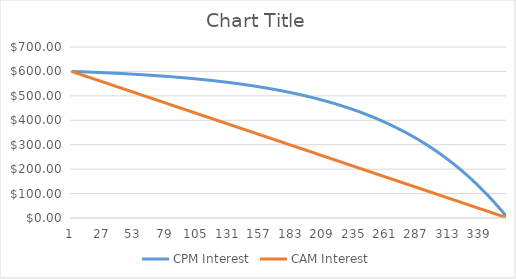
| Category | CPM Interest | CAM Interest |
|---|---|---|
| 0 | 600 | 600 |
| 1 | 599.828 | 598.333 |
| 2 | 599.655 | 596.667 |
| 3 | 599.48 | 595 |
| 4 | 599.303 | 593.333 |
| 5 | 599.124 | 591.667 |
| 6 | 598.944 | 590 |
| 7 | 598.762 | 588.333 |
| 8 | 598.578 | 586.667 |
| 9 | 598.392 | 585 |
| 10 | 598.204 | 583.333 |
| 11 | 598.014 | 581.667 |
| 12 | 597.823 | 580 |
| 13 | 597.629 | 578.333 |
| 14 | 597.434 | 576.667 |
| 15 | 597.237 | 575 |
| 16 | 597.037 | 573.333 |
| 17 | 596.836 | 571.667 |
| 18 | 596.633 | 570 |
| 19 | 596.427 | 568.333 |
| 20 | 596.22 | 566.667 |
| 21 | 596.01 | 565 |
| 22 | 595.799 | 563.333 |
| 23 | 595.585 | 561.667 |
| 24 | 595.369 | 560 |
| 25 | 595.151 | 558.333 |
| 26 | 594.931 | 556.667 |
| 27 | 594.709 | 555 |
| 28 | 594.484 | 553.333 |
| 29 | 594.257 | 551.667 |
| 30 | 594.028 | 550 |
| 31 | 593.797 | 548.333 |
| 32 | 593.563 | 546.667 |
| 33 | 593.327 | 545 |
| 34 | 593.089 | 543.333 |
| 35 | 592.848 | 541.667 |
| 36 | 592.605 | 540 |
| 37 | 592.359 | 538.333 |
| 38 | 592.111 | 536.667 |
| 39 | 591.86 | 535 |
| 40 | 591.607 | 533.333 |
| 41 | 591.352 | 531.667 |
| 42 | 591.094 | 530 |
| 43 | 590.833 | 528.333 |
| 44 | 590.57 | 526.667 |
| 45 | 590.304 | 525 |
| 46 | 590.035 | 523.333 |
| 47 | 589.764 | 521.667 |
| 48 | 589.49 | 520 |
| 49 | 589.213 | 518.333 |
| 50 | 588.933 | 516.667 |
| 51 | 588.651 | 515 |
| 52 | 588.366 | 513.333 |
| 53 | 588.078 | 511.667 |
| 54 | 587.787 | 510 |
| 55 | 587.493 | 508.333 |
| 56 | 587.196 | 506.667 |
| 57 | 586.897 | 505 |
| 58 | 586.594 | 503.333 |
| 59 | 586.288 | 501.667 |
| 60 | 585.979 | 500 |
| 61 | 585.667 | 498.333 |
| 62 | 585.352 | 496.667 |
| 63 | 585.034 | 495 |
| 64 | 584.713 | 493.333 |
| 65 | 584.388 | 491.667 |
| 66 | 584.061 | 490 |
| 67 | 583.73 | 488.333 |
| 68 | 583.395 | 486.667 |
| 69 | 583.057 | 485 |
| 70 | 582.716 | 483.333 |
| 71 | 582.372 | 481.667 |
| 72 | 582.024 | 480 |
| 73 | 581.672 | 478.333 |
| 74 | 581.317 | 476.667 |
| 75 | 580.959 | 475 |
| 76 | 580.597 | 473.333 |
| 77 | 580.231 | 471.667 |
| 78 | 579.862 | 470 |
| 79 | 579.489 | 468.333 |
| 80 | 579.112 | 466.667 |
| 81 | 578.731 | 465 |
| 82 | 578.347 | 463.333 |
| 83 | 577.959 | 461.667 |
| 84 | 577.567 | 460 |
| 85 | 577.171 | 458.333 |
| 86 | 576.771 | 456.667 |
| 87 | 576.367 | 455 |
| 88 | 575.959 | 453.333 |
| 89 | 575.547 | 451.667 |
| 90 | 575.131 | 450 |
| 91 | 574.71 | 448.333 |
| 92 | 574.286 | 446.667 |
| 93 | 573.857 | 445 |
| 94 | 573.424 | 443.333 |
| 95 | 572.986 | 441.667 |
| 96 | 572.544 | 440 |
| 97 | 572.098 | 438.333 |
| 98 | 571.647 | 436.667 |
| 99 | 571.192 | 435 |
| 100 | 570.733 | 433.333 |
| 101 | 570.268 | 431.667 |
| 102 | 569.799 | 430 |
| 103 | 569.325 | 428.333 |
| 104 | 568.847 | 426.667 |
| 105 | 568.364 | 425 |
| 106 | 567.876 | 423.333 |
| 107 | 567.383 | 421.667 |
| 108 | 566.885 | 420 |
| 109 | 566.382 | 418.333 |
| 110 | 565.874 | 416.667 |
| 111 | 565.361 | 415 |
| 112 | 564.843 | 413.333 |
| 113 | 564.32 | 411.667 |
| 114 | 563.792 | 410 |
| 115 | 563.258 | 408.333 |
| 116 | 562.719 | 406.667 |
| 117 | 562.174 | 405 |
| 118 | 561.624 | 403.333 |
| 119 | 561.069 | 401.667 |
| 120 | 560.508 | 400 |
| 121 | 559.941 | 398.333 |
| 122 | 559.369 | 396.667 |
| 123 | 558.791 | 395 |
| 124 | 558.207 | 393.333 |
| 125 | 557.618 | 391.667 |
| 126 | 557.022 | 390 |
| 127 | 556.421 | 388.333 |
| 128 | 555.813 | 386.667 |
| 129 | 555.2 | 385 |
| 130 | 554.58 | 383.333 |
| 131 | 553.954 | 381.667 |
| 132 | 553.322 | 380 |
| 133 | 552.684 | 378.333 |
| 134 | 552.039 | 376.667 |
| 135 | 551.388 | 375 |
| 136 | 550.73 | 373.333 |
| 137 | 550.065 | 371.667 |
| 138 | 549.394 | 370 |
| 139 | 548.717 | 368.333 |
| 140 | 548.032 | 366.667 |
| 141 | 547.341 | 365 |
| 142 | 546.642 | 363.333 |
| 143 | 545.937 | 361.667 |
| 144 | 545.225 | 360 |
| 145 | 544.505 | 358.333 |
| 146 | 543.779 | 356.667 |
| 147 | 543.045 | 355 |
| 148 | 542.304 | 353.333 |
| 149 | 541.555 | 351.667 |
| 150 | 540.799 | 350 |
| 151 | 540.035 | 348.333 |
| 152 | 539.264 | 346.667 |
| 153 | 538.485 | 345 |
| 154 | 537.698 | 343.333 |
| 155 | 536.903 | 341.667 |
| 156 | 536.101 | 340 |
| 157 | 535.29 | 338.333 |
| 158 | 534.471 | 336.667 |
| 159 | 533.644 | 335 |
| 160 | 532.809 | 333.333 |
| 161 | 531.966 | 331.667 |
| 162 | 531.114 | 330 |
| 163 | 530.253 | 328.333 |
| 164 | 529.384 | 326.667 |
| 165 | 528.506 | 325 |
| 166 | 527.619 | 323.333 |
| 167 | 526.724 | 321.667 |
| 168 | 525.819 | 320 |
| 169 | 524.906 | 318.333 |
| 170 | 523.983 | 316.667 |
| 171 | 523.052 | 315 |
| 172 | 522.11 | 313.333 |
| 173 | 521.16 | 311.667 |
| 174 | 520.2 | 310 |
| 175 | 519.23 | 308.333 |
| 176 | 518.251 | 306.667 |
| 177 | 517.262 | 305 |
| 178 | 516.262 | 303.333 |
| 179 | 515.253 | 301.667 |
| 180 | 514.234 | 300 |
| 181 | 513.205 | 298.333 |
| 182 | 512.165 | 296.667 |
| 183 | 511.115 | 295 |
| 184 | 510.055 | 293.333 |
| 185 | 508.984 | 291.667 |
| 186 | 507.902 | 290 |
| 187 | 506.809 | 288.333 |
| 188 | 505.706 | 286.667 |
| 189 | 504.591 | 285 |
| 190 | 503.465 | 283.333 |
| 191 | 502.328 | 281.667 |
| 192 | 501.18 | 280 |
| 193 | 500.02 | 278.333 |
| 194 | 498.848 | 276.667 |
| 195 | 497.665 | 275 |
| 196 | 496.47 | 273.333 |
| 197 | 495.263 | 271.667 |
| 198 | 494.044 | 270 |
| 199 | 492.813 | 268.333 |
| 200 | 491.569 | 266.667 |
| 201 | 490.313 | 265 |
| 202 | 489.045 | 263.333 |
| 203 | 487.764 | 261.667 |
| 204 | 486.47 | 260 |
| 205 | 485.163 | 258.333 |
| 206 | 483.843 | 256.667 |
| 207 | 482.509 | 255 |
| 208 | 481.163 | 253.333 |
| 209 | 479.803 | 251.667 |
| 210 | 478.429 | 250 |
| 211 | 477.042 | 248.333 |
| 212 | 475.64 | 246.667 |
| 213 | 474.225 | 245 |
| 214 | 472.796 | 243.333 |
| 215 | 471.352 | 241.667 |
| 216 | 469.894 | 240 |
| 217 | 468.421 | 238.333 |
| 218 | 466.934 | 236.667 |
| 219 | 465.431 | 235 |
| 220 | 463.914 | 233.333 |
| 221 | 462.381 | 231.667 |
| 222 | 460.834 | 230 |
| 223 | 459.27 | 228.333 |
| 224 | 457.691 | 226.667 |
| 225 | 456.096 | 225 |
| 226 | 454.486 | 223.333 |
| 227 | 452.859 | 221.667 |
| 228 | 451.216 | 220 |
| 229 | 449.556 | 218.333 |
| 230 | 447.88 | 216.667 |
| 231 | 446.187 | 215 |
| 232 | 444.478 | 213.333 |
| 233 | 442.751 | 211.667 |
| 234 | 441.006 | 210 |
| 235 | 439.245 | 208.333 |
| 236 | 437.466 | 206.667 |
| 237 | 435.669 | 205 |
| 238 | 433.854 | 203.333 |
| 239 | 432.02 | 201.667 |
| 240 | 430.169 | 200 |
| 241 | 428.299 | 198.333 |
| 242 | 426.41 | 196.667 |
| 243 | 424.503 | 195 |
| 244 | 422.576 | 193.333 |
| 245 | 420.63 | 191.667 |
| 246 | 418.665 | 190 |
| 247 | 416.68 | 188.333 |
| 248 | 414.675 | 186.667 |
| 249 | 412.65 | 185 |
| 250 | 410.605 | 183.333 |
| 251 | 408.539 | 181.667 |
| 252 | 406.453 | 180 |
| 253 | 404.346 | 178.333 |
| 254 | 402.218 | 176.667 |
| 255 | 400.068 | 175 |
| 256 | 397.897 | 173.333 |
| 257 | 395.704 | 171.667 |
| 258 | 393.49 | 170 |
| 259 | 391.253 | 168.333 |
| 260 | 388.994 | 166.667 |
| 261 | 386.712 | 165 |
| 262 | 384.407 | 163.333 |
| 263 | 382.08 | 161.667 |
| 264 | 379.729 | 160 |
| 265 | 377.355 | 158.333 |
| 266 | 374.957 | 156.667 |
| 267 | 372.534 | 155 |
| 268 | 370.088 | 153.333 |
| 269 | 367.617 | 151.667 |
| 270 | 365.122 | 150 |
| 271 | 362.601 | 148.333 |
| 272 | 360.056 | 146.667 |
| 273 | 357.485 | 145 |
| 274 | 354.888 | 143.333 |
| 275 | 352.265 | 141.667 |
| 276 | 349.616 | 140 |
| 277 | 346.94 | 138.333 |
| 278 | 344.238 | 136.667 |
| 279 | 341.509 | 135 |
| 280 | 338.752 | 133.333 |
| 281 | 335.968 | 131.667 |
| 282 | 333.156 | 130 |
| 283 | 330.316 | 128.333 |
| 284 | 327.447 | 126.667 |
| 285 | 324.55 | 125 |
| 286 | 321.624 | 123.333 |
| 287 | 318.669 | 121.667 |
| 288 | 315.684 | 120 |
| 289 | 312.669 | 118.333 |
| 290 | 309.624 | 116.667 |
| 291 | 306.548 | 115 |
| 292 | 303.442 | 113.333 |
| 293 | 300.305 | 111.667 |
| 294 | 297.136 | 110 |
| 295 | 293.936 | 108.333 |
| 296 | 290.704 | 106.667 |
| 297 | 287.439 | 105 |
| 298 | 284.142 | 103.333 |
| 299 | 280.811 | 101.667 |
| 300 | 277.448 | 100 |
| 301 | 274.051 | 98.333 |
| 302 | 270.62 | 96.667 |
| 303 | 267.154 | 95 |
| 304 | 263.654 | 93.333 |
| 305 | 260.119 | 91.667 |
| 306 | 256.548 | 90 |
| 307 | 252.942 | 88.333 |
| 308 | 249.3 | 86.667 |
| 309 | 245.621 | 85 |
| 310 | 241.906 | 83.333 |
| 311 | 238.153 | 81.667 |
| 312 | 234.363 | 80 |
| 313 | 230.535 | 78.333 |
| 314 | 226.669 | 76.667 |
| 315 | 222.764 | 75 |
| 316 | 218.82 | 73.333 |
| 317 | 214.836 | 71.667 |
| 318 | 210.813 | 70 |
| 319 | 206.749 | 68.333 |
| 320 | 202.645 | 66.667 |
| 321 | 198.5 | 65 |
| 322 | 194.313 | 63.333 |
| 323 | 190.085 | 61.667 |
| 324 | 185.814 | 60 |
| 325 | 181.5 | 58.333 |
| 326 | 177.144 | 56.667 |
| 327 | 172.743 | 55 |
| 328 | 168.299 | 53.333 |
| 329 | 163.81 | 51.667 |
| 330 | 159.277 | 50 |
| 331 | 154.698 | 48.333 |
| 332 | 150.073 | 46.667 |
| 333 | 145.402 | 45 |
| 334 | 140.685 | 43.333 |
| 335 | 135.92 | 41.667 |
| 336 | 131.107 | 40 |
| 337 | 126.247 | 38.333 |
| 338 | 121.337 | 36.667 |
| 339 | 116.379 | 35 |
| 340 | 111.371 | 33.333 |
| 341 | 106.313 | 31.667 |
| 342 | 101.205 | 30 |
| 343 | 96.045 | 28.333 |
| 344 | 90.834 | 26.667 |
| 345 | 85.571 | 25 |
| 346 | 80.255 | 23.333 |
| 347 | 74.886 | 21.667 |
| 348 | 69.463 | 20 |
| 349 | 63.986 | 18.333 |
| 350 | 58.454 | 16.667 |
| 351 | 52.867 | 15 |
| 352 | 47.224 | 13.333 |
| 353 | 41.524 | 11.667 |
| 354 | 35.768 | 10 |
| 355 | 29.954 | 8.333 |
| 356 | 24.082 | 6.667 |
| 357 | 18.151 | 5 |
| 358 | 12.161 | 3.333 |
| 359 | 6.111 | 1.667 |